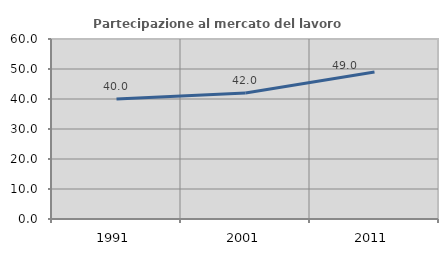
| Category | Partecipazione al mercato del lavoro  femminile |
|---|---|
| 1991.0 | 40 |
| 2001.0 | 41.975 |
| 2011.0 | 48.996 |